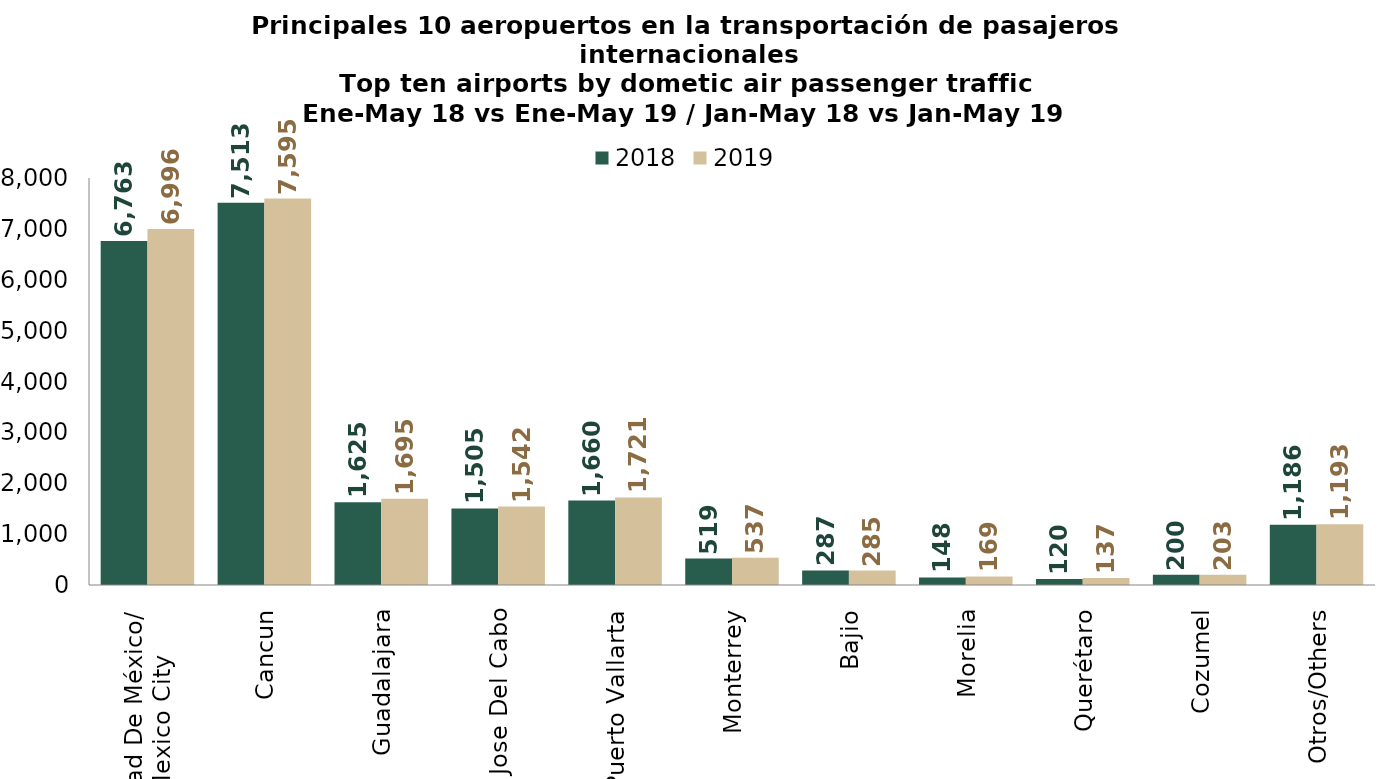
| Category | 2018 | 2019 |
|---|---|---|
| Ciudad De México/
Mexico City | 6763.339 | 6995.889 |
| Cancun | 7513.129 | 7594.936 |
| Guadalajara | 1624.94 | 1695.121 |
| San Jose Del Cabo | 1504.531 | 1542.099 |
| Puerto Vallarta | 1659.875 | 1721.21 |
| Monterrey | 518.97 | 536.81 |
| Bajio | 286.775 | 284.574 |
| Morelia | 147.949 | 169.423 |
| Querétaro | 119.584 | 136.994 |
| Cozumel | 200.312 | 202.711 |
| Otros/Others | 1185.701 | 1192.881 |